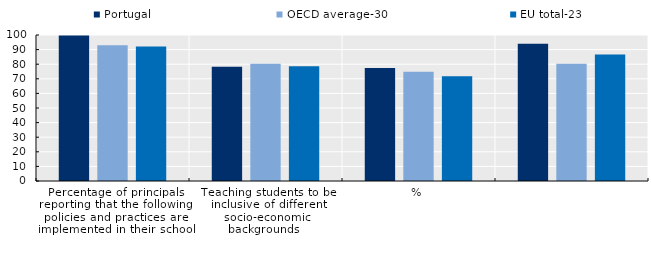
| Category | Portugal | OECD average-30 | EU total-23 |
|---|---|---|---|
| 0 | 99.588 | 92.949 | 92.069 |
| 1 | 78.307 | 80.244 | 78.525 |
| 2 | 77.344 | 74.845 | 71.799 |
| 3 | 93.955 | 80.321 | 86.582 |